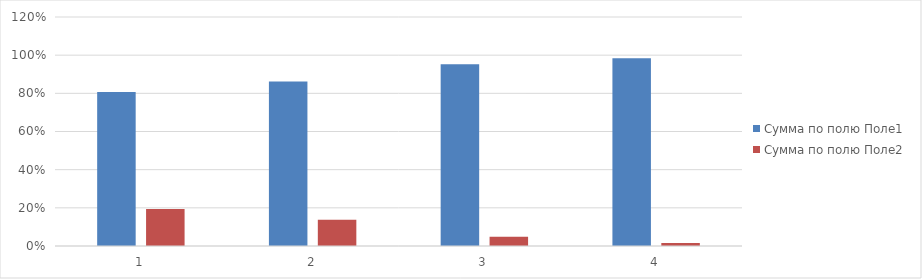
| Category | Сумма по полю Поле1 | Сумма по полю Поле2 |
|---|---|---|
| 1 | 0.807 | 0.193 |
| 2 | 0.862 | 0.138 |
| 3 | 0.952 | 0.048 |
| 4 | 0.984 | 0.016 |